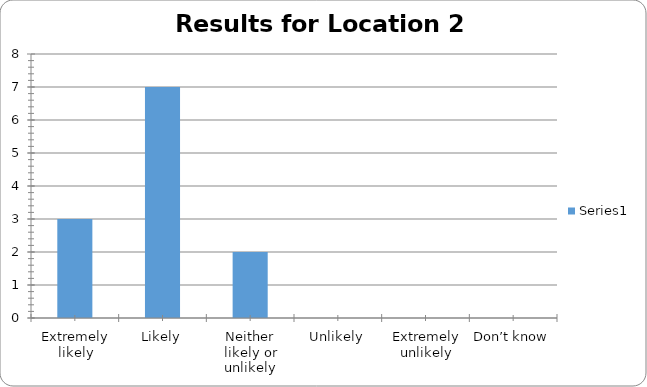
| Category | Series 0 |
|---|---|
| Extremely likely | 3 |
| Likely | 7 |
| Neither likely or unlikely | 2 |
| Unlikely | 0 |
| Extremely unlikely | 0 |
| Don’t know | 0 |